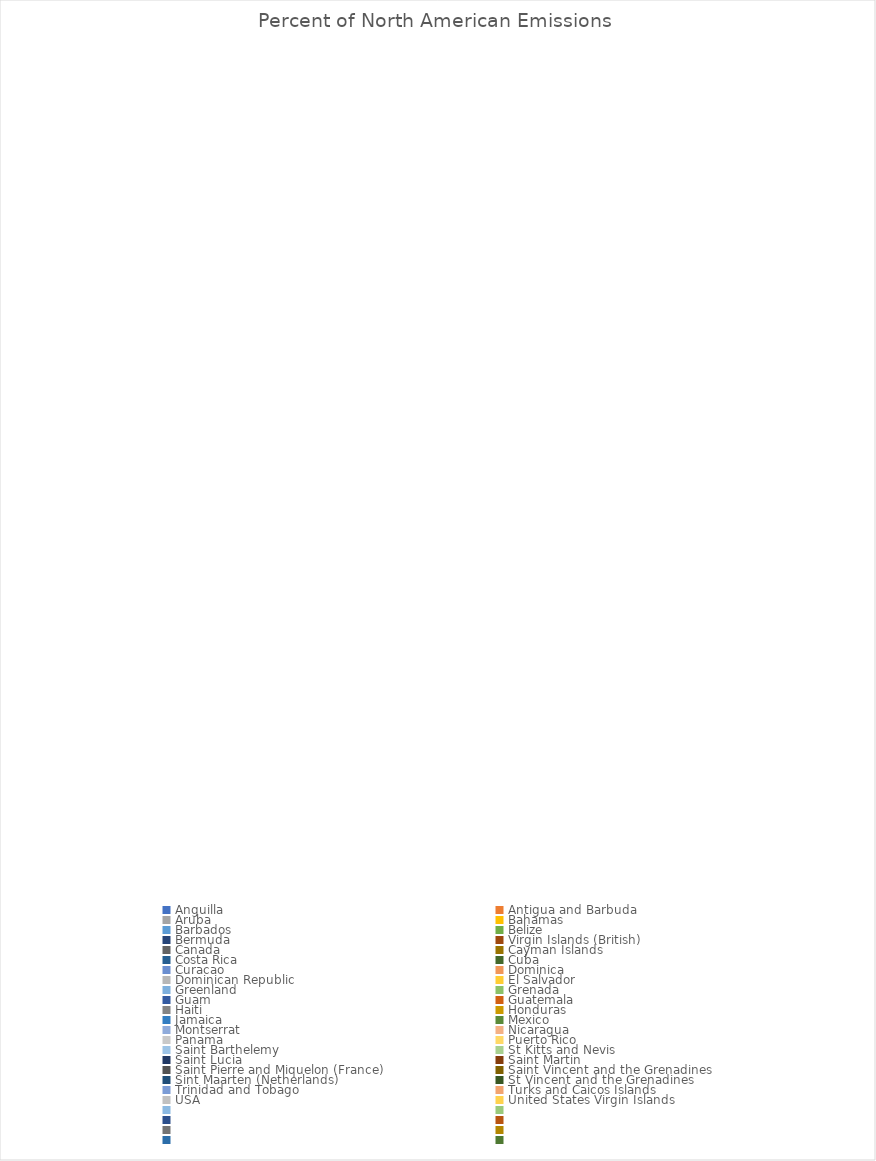
| Category | Percent of North American Emissions  |
|---|---|
| Anguilla | 0 |
| Antigua and Barbuda | 0 |
| Aruba | 0 |
| Bahamas | 0 |
| Barbados | 0 |
| Belize | 0 |
| Bermuda | 0 |
| Virgin Islands (British) | 0 |
| Canada | 0 |
| Cayman Islands | 0 |
| Costa Rica | 0 |
| Cuba | 0 |
| Curacao | 0 |
| Dominica | 0 |
| Dominican Republic | 0 |
| El Salvador | 0 |
| Greenland | 0 |
| Grenada | 0 |
| Guam | 0 |
| Guatemala | 0 |
| Haiti | 0 |
| Honduras | 0 |
| Jamaica | 0 |
| Mexico | 0 |
| Montserrat | 0 |
| Nicaragua | 0 |
| Panama | 0 |
| Puerto Rico | 0 |
| Saint Barthelemy | 0 |
| St Kitts and Nevis | 0 |
| Saint Lucia | 0 |
| Saint Martin | 0 |
| Saint Pierre and Miquelon (France) | 0 |
| Saint Vincent and the Grenadines | 0 |
| Sint Maarten (Netherlands) | 0 |
| St Vincent and the Grenadines | 0 |
| Trinidad and Tobago | 0 |
| Turks and Caicos Islands | 0 |
| USA | 0 |
| United States Virgin Islands | 0 |